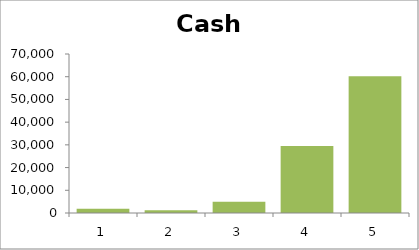
| Category | Cash balance |
|---|---|
| 0 | 1845.731 |
| 1 | 1156.132 |
| 2 | 4951.161 |
| 3 | 29450.848 |
| 4 | 60163.59 |